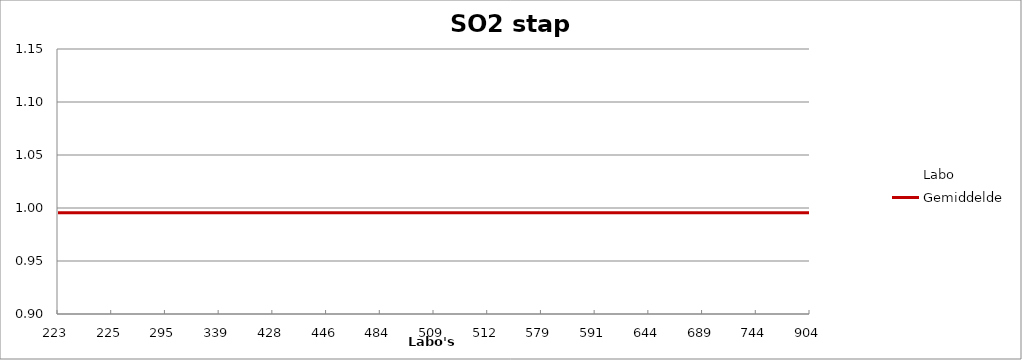
| Category | Labo | Gemiddelde |
|---|---|---|
| 223.0 | 1.039 | 0.996 |
| 225.0 | 0.977 | 0.996 |
| 295.0 | 0.986 | 0.996 |
| 339.0 | 0.995 | 0.996 |
| 428.0 | 1.136 | 0.996 |
| 446.0 | 0.986 | 0.996 |
| 484.0 | 1.056 | 0.996 |
| 509.0 | 0.986 | 0.996 |
| 512.0 | 0.968 | 0.996 |
| 579.0 | 0.968 | 0.996 |
| 591.0 | 0.986 | 0.996 |
| 644.0 | 0.951 | 0.996 |
| 689.0 | 0.986 | 0.996 |
| 744.0 | 1.039 | 0.996 |
| 904.0 | 0.968 | 0.996 |